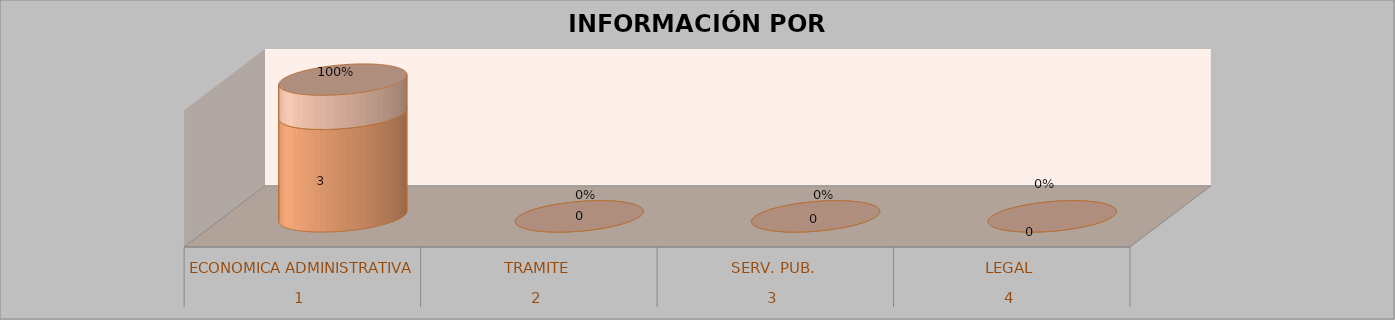
| Category | Series 0 | Series 1 | Series 2 | Series 3 |
|---|---|---|---|---|
| 0 |  |  | 3 | 1 |
| 1 |  |  | 0 | 0 |
| 2 |  |  | 0 | 0 |
| 3 |  |  | 0 | 0 |